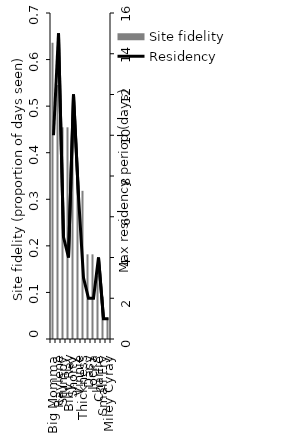
| Category | Site fidelity |
|---|---|
| 	Big Momma | 0.636 |
| _x0007_Raylene | 0.545 |
| _x0006_Stumpy | 0.455 |
| 	Billy Ray | 0.455 |
| _x0006_Shorty | 0.455 |
| _x0006_Vinnie | 0.364 |
| 	Thickness | 0.318 |
| _x0004_Dasy | 0.182 |
| _x0005_Jocka | 0.182 |
| _x0007_Charlie | 0.136 |
| 	Small Fry | 0.091 |
| _x000b_Miley Cyray | 0.045 |